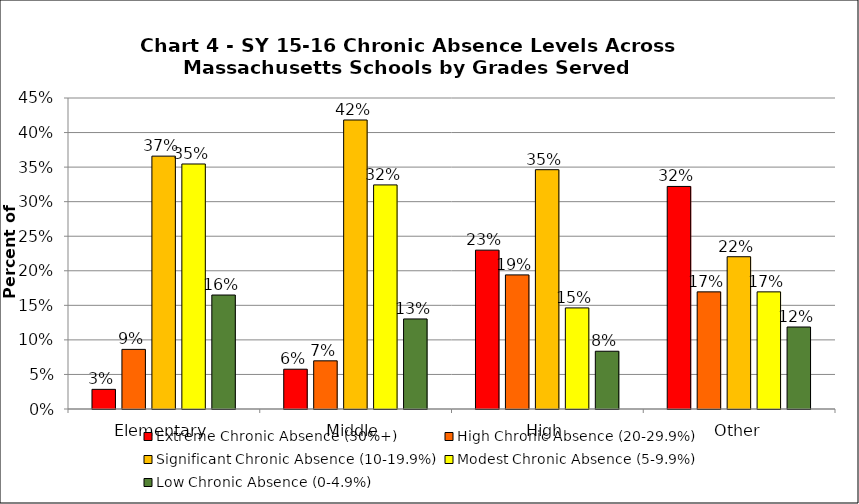
| Category | Extreme Chronic Absence (30%+) | High Chronic Absence (20-29.9%) | Significant Chronic Absence (10-19.9%) | Modest Chronic Absence (5-9.9%) | Low Chronic Absence (0-4.9%) |
|---|---|---|---|---|---|
| 0 | 0.028 | 0.086 | 0.366 | 0.355 | 0.165 |
| 1 | 0.058 | 0.07 | 0.418 | 0.324 | 0.13 |
| 2 | 0.23 | 0.194 | 0.346 | 0.146 | 0.084 |
| 3 | 0.322 | 0.169 | 0.22 | 0.169 | 0.119 |